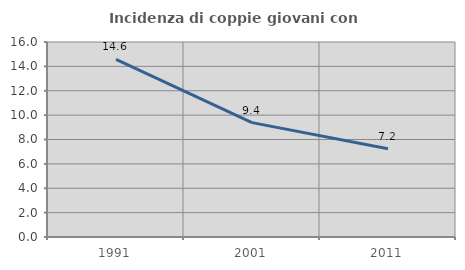
| Category | Incidenza di coppie giovani con figli |
|---|---|
| 1991.0 | 14.572 |
| 2001.0 | 9.386 |
| 2011.0 | 7.245 |